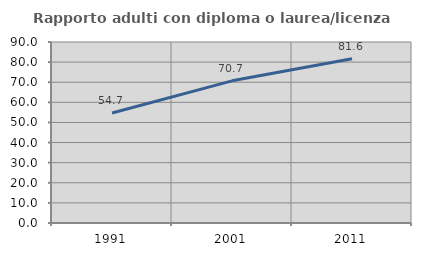
| Category | Rapporto adulti con diploma o laurea/licenza media  |
|---|---|
| 1991.0 | 54.717 |
| 2001.0 | 70.69 |
| 2011.0 | 81.633 |